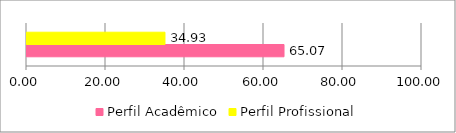
| Category | Perfil Acadêmico | Perfil Profissional |
|---|---|---|
| 0 | 65.068 | 34.932 |